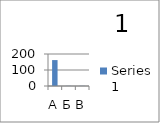
| Category | Series 0 |
|---|---|
| А | 162 |
| Б | 1 |
| В | 1 |